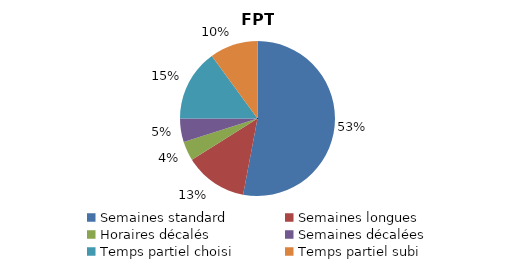
| Category | FPT | FPE |
|---|---|---|
| Semaines standard | 52.976 | 45.14 |
| Semaines longues | 13.088 | 19.788 |
| Horaires décalés | 4.009 | 4.898 |
| Semaines décalées | 4.901 | 12.83 |
| Temps partiel choisi | 14.992 | 12.093 |
| Temps partiel subi | 10.033 | 5.251 |